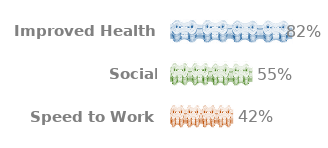
| Category | Series 0 |
|---|---|
| Improved Health | 0.82 |
| Social Engagement | 0.55 |
| Speed to Work | 0.42 |